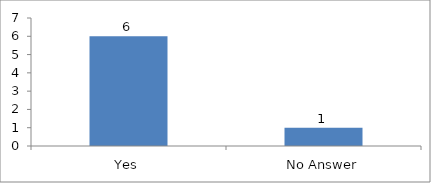
| Category | Would you like to recommend this session to your friend or colleague? |
|---|---|
| Yes | 6 |
| No Answer | 1 |